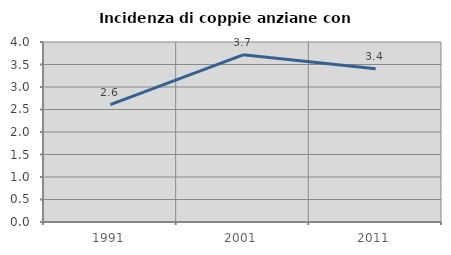
| Category | Incidenza di coppie anziane con figli |
|---|---|
| 1991.0 | 2.609 |
| 2001.0 | 3.714 |
| 2011.0 | 3.406 |